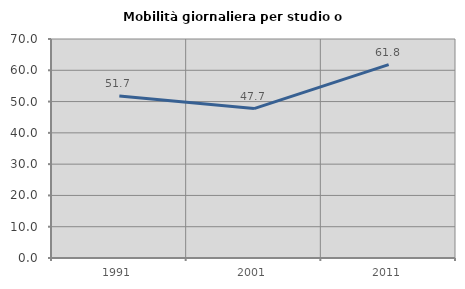
| Category | Mobilità giornaliera per studio o lavoro |
|---|---|
| 1991.0 | 51.748 |
| 2001.0 | 47.748 |
| 2011.0 | 61.798 |